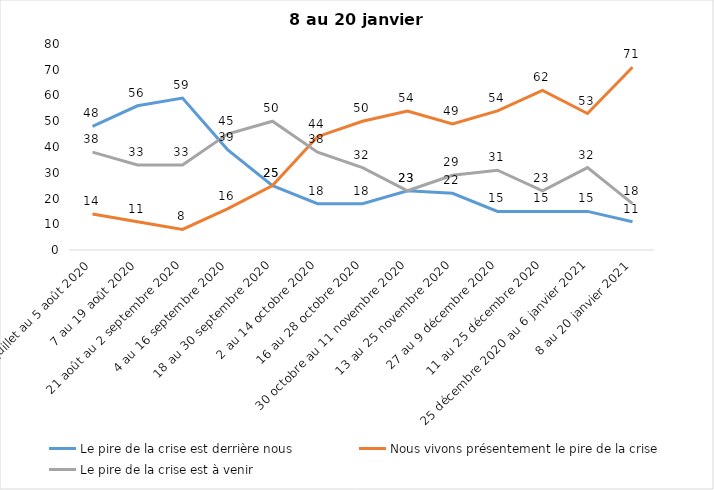
| Category | Le pire de la crise est derrière nous | Nous vivons présentement le pire de la crise | Le pire de la crise est à venir |
|---|---|---|---|
| 24 juillet au 5 août 2020 | 48 | 14 | 38 |
| 7 au 19 août 2020 | 56 | 11 | 33 |
| 21 août au 2 septembre 2020 | 59 | 8 | 33 |
| 4 au 16 septembre 2020 | 39 | 16 | 45 |
| 18 au 30 septembre 2020 | 25 | 25 | 50 |
| 2 au 14 octobre 2020 | 18 | 44 | 38 |
| 16 au 28 octobre 2020 | 18 | 50 | 32 |
| 30 octobre au 11 novembre 2020 | 23 | 54 | 23 |
| 13 au 25 novembre 2020 | 22 | 49 | 29 |
| 27 au 9 décembre 2020 | 15 | 54 | 31 |
| 11 au 25 décembre 2020 | 15 | 62 | 23 |
| 25 décembre 2020 au 6 janvier 2021 | 15 | 53 | 32 |
| 8 au 20 janvier 2021 | 11 | 71 | 18 |